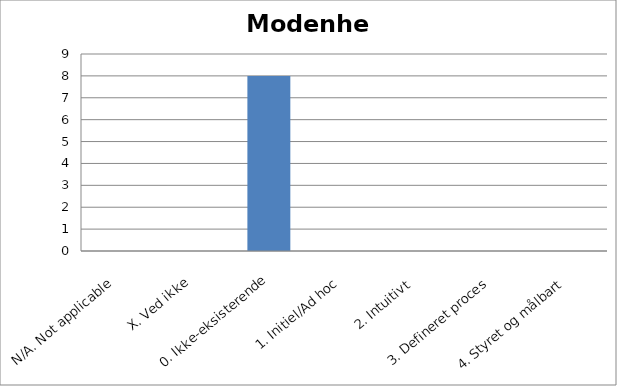
| Category | Count |
|---|---|
| N/A. Not applicable | 0 |
| X. Ved ikke | 0 |
| 0. Ikke-eksisterende | 8 |
| 1. Initiel/Ad hoc | 0 |
| 2. Intuitivt  | 0 |
| 3. Defineret proces | 0 |
| 4. Styret og målbart | 0 |